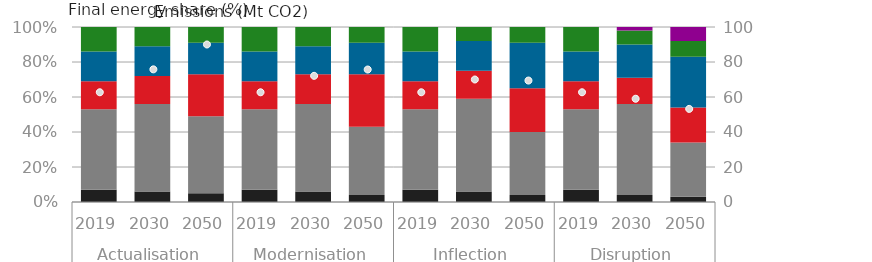
| Category | Coal | Oil | Natural gas | Electricity | Biofuels and waste | Hydrogen |
|---|---|---|---|---|---|---|
| 0 | 0.07 | 0.46 | 0.16 | 0.17 | 0.14 | 0 |
| 1 | 0.06 | 0.5 | 0.16 | 0.17 | 0.11 | 0 |
| 2 | 0.05 | 0.44 | 0.24 | 0.18 | 0.09 | 0 |
| 3 | 0.07 | 0.46 | 0.16 | 0.17 | 0.14 | 0 |
| 4 | 0.06 | 0.5 | 0.17 | 0.16 | 0.11 | 0 |
| 5 | 0.04 | 0.39 | 0.3 | 0.18 | 0.09 | 0 |
| 6 | 0.07 | 0.46 | 0.16 | 0.17 | 0.14 | 0 |
| 7 | 0.06 | 0.53 | 0.16 | 0.17 | 0.08 | 0 |
| 8 | 0.04 | 0.36 | 0.25 | 0.26 | 0.09 | 0 |
| 9 | 0.07 | 0.46 | 0.16 | 0.17 | 0.14 | 0 |
| 10 | 0.04 | 0.52 | 0.15 | 0.19 | 0.08 | 0.02 |
| 11 | 0.03 | 0.31 | 0.2 | 0.29 | 0.09 | 0.08 |